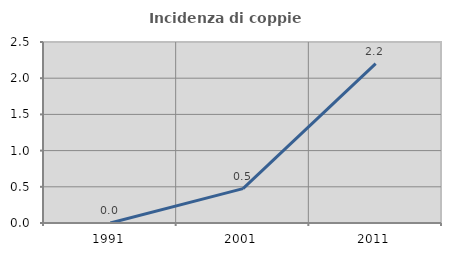
| Category | Incidenza di coppie miste |
|---|---|
| 1991.0 | 0 |
| 2001.0 | 0.475 |
| 2011.0 | 2.2 |